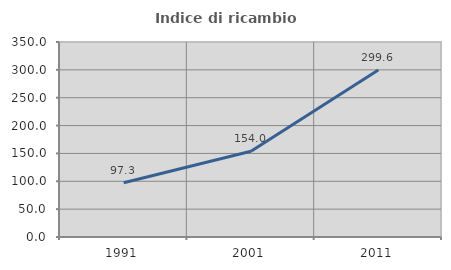
| Category | Indice di ricambio occupazionale  |
|---|---|
| 1991.0 | 97.263 |
| 2001.0 | 154.026 |
| 2011.0 | 299.643 |